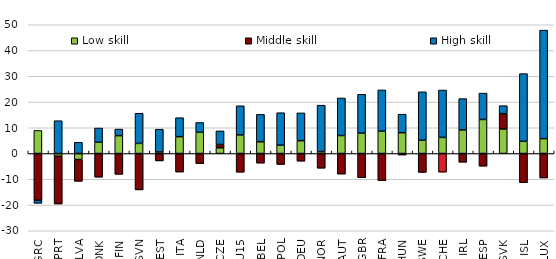
| Category | Low skill  | Middle skill | High skill |
|---|---|---|---|
| GRC | 8.956 | -18.137 | -1.196 |
| PRT | -1.058 | -18.543 | 12.741 |
| LVA | -2.342 | -8.451 | 4.356 |
| DNK | 4.403 | -9.195 | 5.497 |
| FIN | 6.924 | -8.085 | 2.562 |
| SVN | 3.929 | -14.125 | 11.697 |
| EST | 0.613 | -2.874 | 8.831 |
| ITA | 6.541 | -7.198 | 7.377 |
| NLD | 8.241 | -3.92 | 3.812 |
| CZE | 2.224 | 1.295 | 5.271 |
| EU15 | 7.221 | -7.275 | 11.322 |
| BEL | 4.561 | -3.736 | 10.64 |
| POL | 3.224 | -4.239 | 12.62 |
| DEU | 4.988 | -2.969 | 10.788 |
| NOR | 0.755 | -5.705 | 18.017 |
| AUT | 6.987 | -7.996 | 14.567 |
| GBR | 7.915 | -9.424 | 15.086 |
| FRA | 8.664 | -10.538 | 16.029 |
| HUN | 8.081 | -0.587 | 7.188 |
| SWE | 5.148 | -7.338 | 18.806 |
| CHE | 6.25 | -7.236 | 18.399 |
| IRL | 9.18 | -3.384 | 12.143 |
| ESP | 13.221 | -4.919 | 10.237 |
| SVK | 9.522 | 5.957 | 3.103 |
| ISL | 4.727 | -11.318 | 26.298 |
| LUX | 5.781 | -9.505 | 42.135 |